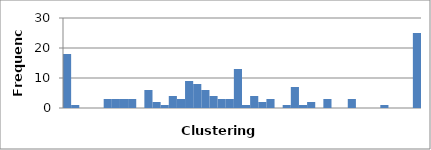
| Category | 18 |
|---|---|
| 0.0 | 18 |
| 0.023255813953488372 | 1 |
| 0.046511627906976744 | 0 |
| 0.06976744186046512 | 0 |
| 0.09302325581395349 | 0 |
| 0.11627906976744186 | 3 |
| 0.13953488372093023 | 3 |
| 0.16279069767441862 | 3 |
| 0.18604651162790697 | 3 |
| 0.20930232558139533 | 0 |
| 0.2325581395348837 | 6 |
| 0.25581395348837205 | 2 |
| 0.2790697674418604 | 1 |
| 0.30232558139534876 | 4 |
| 0.3255813953488371 | 3 |
| 0.3488372093023255 | 9 |
| 0.37209302325581384 | 8 |
| 0.3953488372093022 | 6 |
| 0.41860465116279055 | 4 |
| 0.4418604651162789 | 3 |
| 0.46511627906976727 | 3 |
| 0.4883720930232556 | 13 |
| 0.511627906976744 | 1 |
| 0.5348837209302324 | 4 |
| 0.5581395348837208 | 2 |
| 0.5813953488372092 | 3 |
| 0.6046511627906976 | 0 |
| 0.627906976744186 | 1 |
| 0.6511627906976745 | 7 |
| 0.6744186046511629 | 1 |
| 0.6976744186046513 | 2 |
| 0.7209302325581397 | 0 |
| 0.7441860465116281 | 3 |
| 0.7674418604651165 | 0 |
| 0.790697674418605 | 0 |
| 0.8139534883720934 | 3 |
| 0.8372093023255818 | 0 |
| 0.8604651162790702 | 0 |
| 0.8837209302325586 | 0 |
| 0.906976744186047 | 1 |
| 0.9302325581395354 | 0 |
| 0.9534883720930238 | 0 |
| 0.9767441860465123 | 0 |
| 1.0 | 25 |